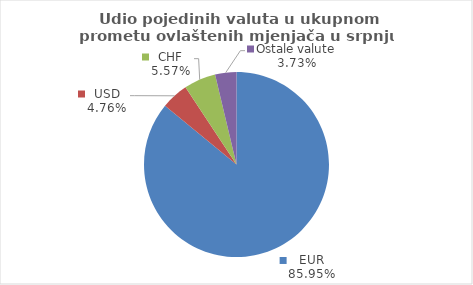
| Category | Series 0 |
|---|---|
| EUR | 85.943 |
| USD | 4.761 |
| CHF | 5.569 |
| Ostale valute | 3.727 |